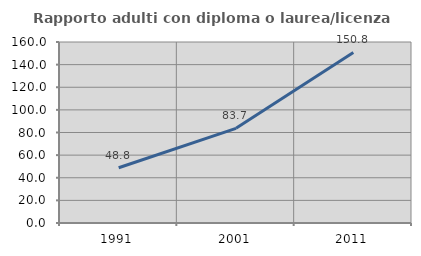
| Category | Rapporto adulti con diploma o laurea/licenza media  |
|---|---|
| 1991.0 | 48.803 |
| 2001.0 | 83.686 |
| 2011.0 | 150.763 |